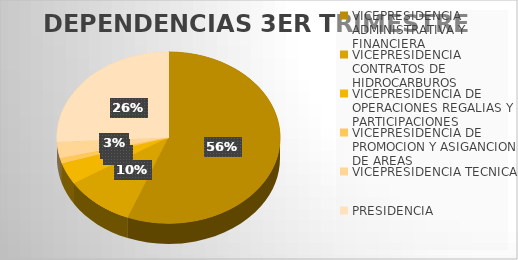
| Category | Series 0 |
|---|---|
| VICEPRESIDENCIA ADMINISTRATIVA Y FINANCIERA | 221 |
| VICEPRESIDENCIA CONTRATOS DE HIDROCARBUROS | 40 |
| VICEPRESIDENCIA DE OPERACIONES REGALIAS Y PARTICIPACIONES | 16 |
| VICEPRESIDENCIA DE PROMOCION Y ASIGANCION DE AREAS  | 4 |
| VICEPRESIDENCIA TECNICA | 12 |
| PRESIDENCIA  | 102 |